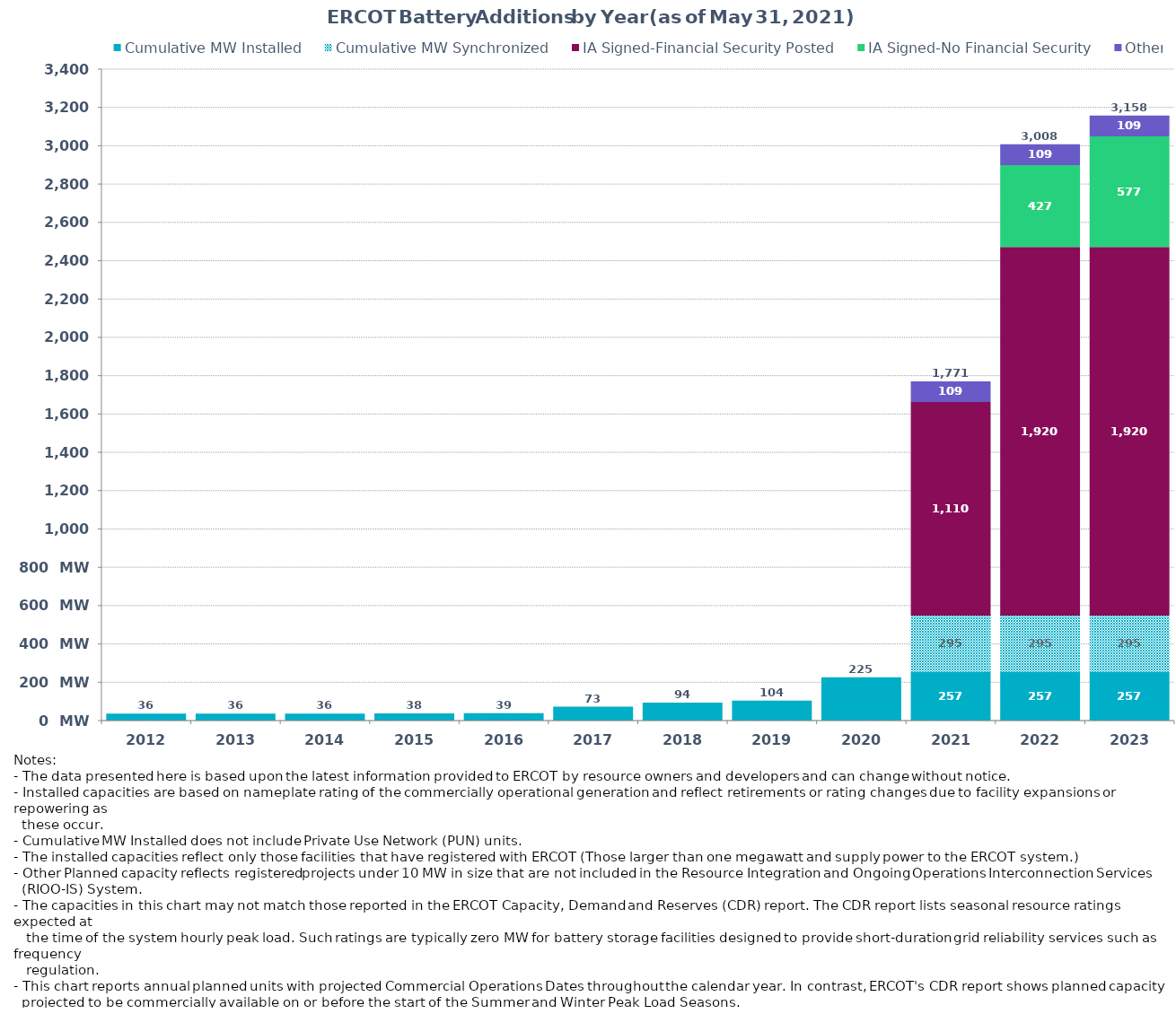
| Category | Cumulative MW Installed | Cumulative MW Synchronized | IA Signed-Financial Security Posted  | IA Signed-No Financial Security  | Other Planned | Cumulative Installed and Planned |
|---|---|---|---|---|---|---|
| 2012.0 | 36 | 0 | 0 | 0 | 0 | 36 |
| 2013.0 | 36 | 0 | 0 | 0 | 0 | 36 |
| 2014.0 | 36 | 0 | 0 | 0 | 0 | 36 |
| 2015.0 | 38 | 0 | 0 | 0 | 0 | 38 |
| 2016.0 | 39 | 0 | 0 | 0 | 0 | 39 |
| 2017.0 | 72.5 | 0 | 0 | 0 | 0 | 72.5 |
| 2018.0 | 93.8 | 0 | 0 | 0 | 0 | 93.8 |
| 2019.0 | 103.7 | 0 | 0 | 0 | 0 | 103.7 |
| 2020.0 | 225.4 | 0 | 0 | 0 | 0 | 225.4 |
| 2021.0 | 257.2 | 294.89 | 1110 | 0 | 108.63 | 1770.72 |
| 2022.0 | 257.2 | 294.89 | 1920 | 427 | 108.63 | 3007.72 |
| 2023.0 | 257.2 | 294.89 | 1920 | 577 | 108.63 | 3157.72 |